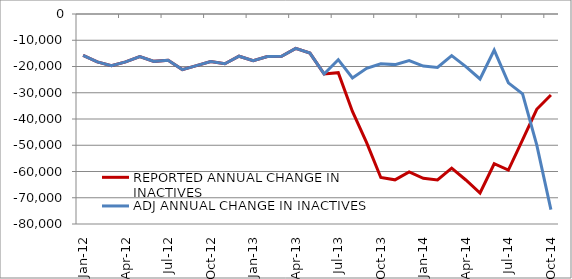
| Category | REPORTED ANNUAL CHANGE IN INACTIVES | ADJ ANNUAL CHANGE IN INACTIVES |
|---|---|---|
| 2012-01-01 | -15758 | -15758 |
| 2012-02-01 | -18247 | -18247 |
| 2012-03-01 | -19702 | -19702 |
| 2012-04-01 | -18218 | -18218 |
| 2012-05-01 | -16223 | -16223 |
| 2012-06-01 | -18041 | -18041 |
| 2012-07-01 | -17648 | -17648 |
| 2012-08-01 | -21176 | -21176 |
| 2012-09-01 | -19670 | -19670 |
| 2012-10-01 | -18125 | -18125 |
| 2012-11-01 | -18937 | -18937 |
| 2012-12-01 | -16092 | -16092 |
| 2013-01-01 | -17801 | -17801 |
| 2013-02-01 | -16205 | -16205 |
| 2013-03-01 | -16137 | -16137 |
| 2013-04-01 | -13079 | -13079 |
| 2013-05-01 | -14904 | -14904 |
| 2013-06-01 | -22835 | -22835 |
| 2013-07-01 | -22354 | -17401 |
| 2013-08-01 | -37123 | -24358 |
| 2013-09-01 | -48996 | -20685 |
| 2013-10-01 | -62296 | -18958 |
| 2013-11-01 | -63179 | -19284 |
| 2013-12-01 | -60149 | -17715.333 |
| 2014-01-01 | -62572 | -19853.333 |
| 2014-02-01 | -63224 | -20381.333 |
| 2014-03-01 | -58744 | -15836.333 |
| 2014-04-01 | -63234 | -20042.333 |
| 2014-05-01 | -68191 | -24759.333 |
| 2014-06-01 | -57038 | -13731.833 |
| 2014-07-01 | -59439 | -26236.333 |
| 2014-08-01 | -47943 | -30425.333 |
| 2014-09-01 | -36302 | -49876.333 |
| 2014-10-01 | -30880 | -74508.333 |